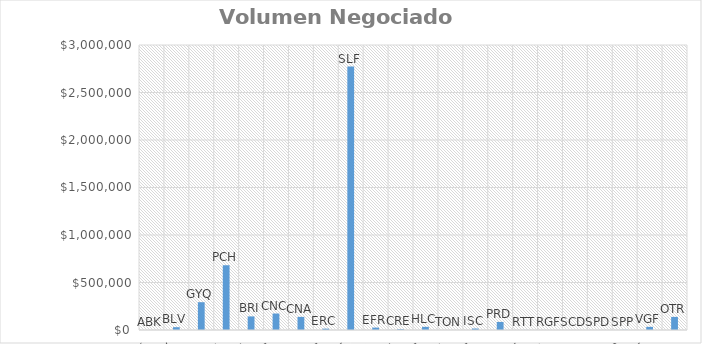
| Category | Volumen |
|---|---|
| ABK | 0 |
| BLV | 29700 |
| GYQ | 292468.42 |
| PCH | 681687.5 |
| BRI | 143050 |
| CNC | 173420 |
| CNA | 138072 |
| ERC | 14313 |
| SLF | 2772692.22 |
| EFR | 25308.4 |
| CRE | 8195.68 |
| HLC | 33259 |
| TON | 0 |
| ISC | 15556 |
| PRD | 84917.18 |
| RTT | 794.5 |
| RGF | 0 |
| SCD | 0 |
| SPD | 272.25 |
| SPP | 2103.15 |
| VGF | 33061.6 |
| OTR | 138026.95 |